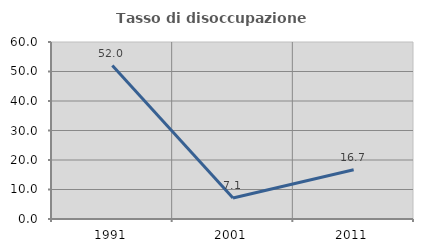
| Category | Tasso di disoccupazione giovanile  |
|---|---|
| 1991.0 | 52 |
| 2001.0 | 7.143 |
| 2011.0 | 16.667 |